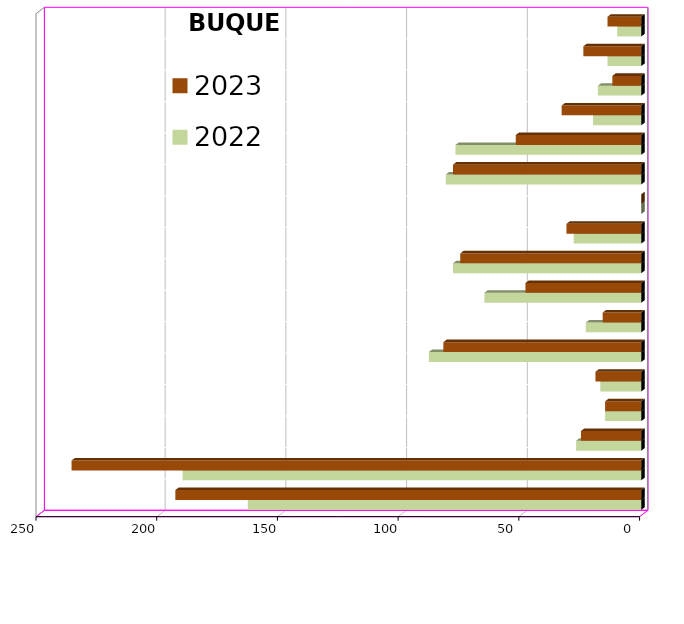
| Category | 2022 | 2023 |
|---|---|---|
| ICAVE | 163 | 193 |
| CICE | 190 | 236 |
| T. C. E. | 27 | 25 |
| CARGILL | 15 | 15 |
| TMV | 17 | 19 |
| SSA | 88 | 82 |
| SEPSA | 23 | 16 |
| VOPAK | 65 | 48 |
| CPV | 78 | 75 |
| EXCELLENCE | 28 | 31 |
| APASCO | 0 | 0 |
| SIPPB | 81 | 78 |
| PEMEX | 77 | 52 |
| PETRA | 20 | 33 |
| OPEVER | 18 | 12 |
| ESJ Renovable III | 14 | 24 |
| Tramitadora del Pac. | 10 | 14 |